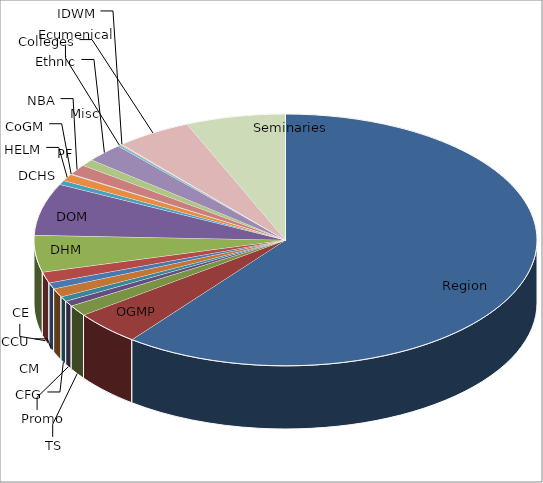
| Category | Series 0 |
|---|---|
| Region | 1564.597 |
| OGMP | 113.423 |
| TS | 35.938 |
| Promo | 17.926 |
| CFG | 16.228 |
| CM | 28.775 |
| CCU | 20.97 |
| CE | 36.591 |
| DHM | 122.238 |
| DOM | 172.698 |
| DCHS | 14.094 |
| HELM | 23.261 |
| CoGM | 1.755 |
| NBA | 33.967 |
| PF | 22.964 |
| Ethnic | 62.773 |
| Ecumenical | 5.576 |
| Misc | 2.506 |
| IDWM | 0 |
| Colleges | 126.021 |
| Seminaries | 165.698 |